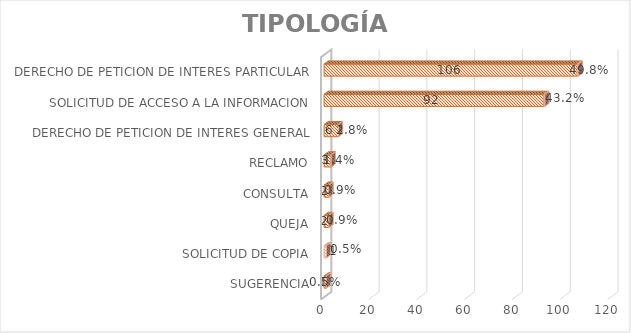
| Category | Cuenta de Número petición | Cuenta de Número petición2 |
|---|---|---|
| SUGERENCIA | 1 | 0.005 |
| SOLICITUD DE COPIA | 1 | 0.005 |
| QUEJA | 2 | 0.009 |
| CONSULTA | 2 | 0.009 |
| RECLAMO | 3 | 0.014 |
| DERECHO DE PETICION DE INTERES GENERAL | 6 | 0.028 |
| SOLICITUD DE ACCESO A LA INFORMACION | 92 | 0.432 |
| DERECHO DE PETICION DE INTERES PARTICULAR | 106 | 0.498 |